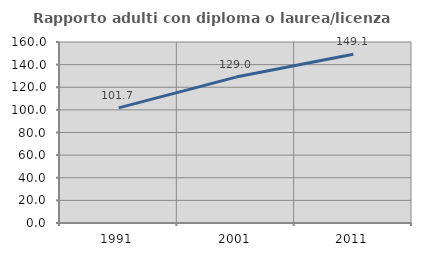
| Category | Rapporto adulti con diploma o laurea/licenza media  |
|---|---|
| 1991.0 | 101.728 |
| 2001.0 | 128.976 |
| 2011.0 | 149.131 |